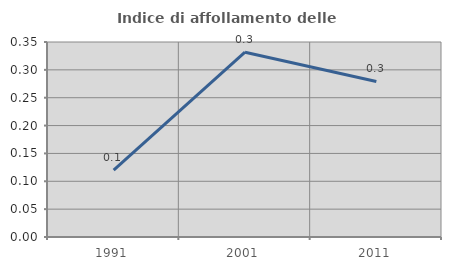
| Category | Indice di affollamento delle abitazioni  |
|---|---|
| 1991.0 | 0.12 |
| 2001.0 | 0.332 |
| 2011.0 | 0.279 |